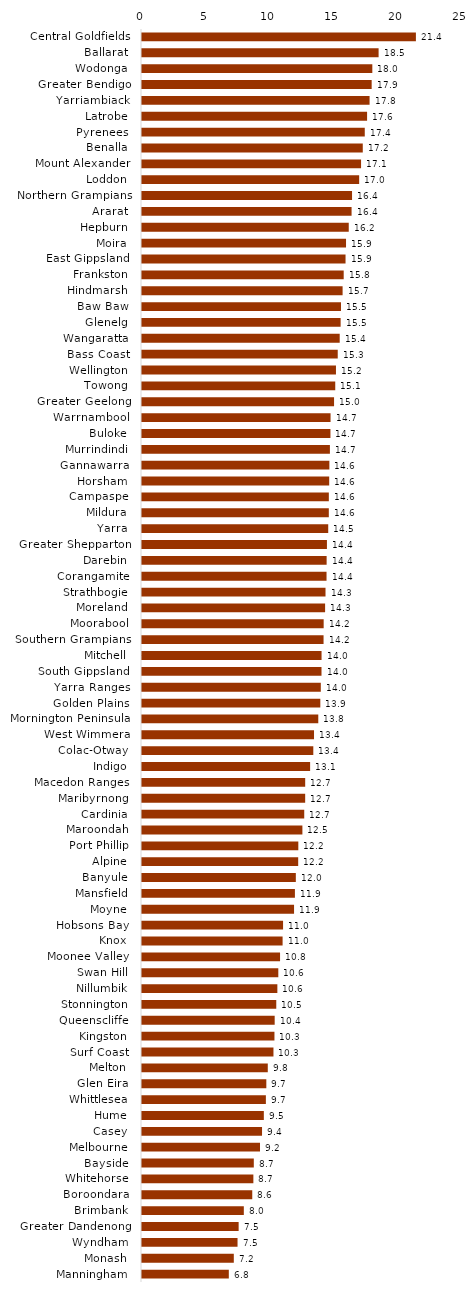
| Category | Series 0 |
|---|---|
| Central Goldfields  | 21.399 |
| Ballarat  | 18.485 |
| Wodonga  | 17.994 |
| Greater Bendigo  | 17.943 |
| Yarriambiack  | 17.779 |
| Latrobe  | 17.585 |
| Pyrenees  | 17.404 |
| Benalla  | 17.248 |
| Mount Alexander  | 17.115 |
| Loddon  | 16.967 |
| Northern Grampians  | 16.41 |
| Ararat  | 16.373 |
| Hepburn  | 16.152 |
| Moira  | 15.94 |
| East Gippsland  | 15.901 |
| Frankston  | 15.757 |
| Hindmarsh  | 15.672 |
| Baw Baw  | 15.546 |
| Glenelg  | 15.518 |
| Wangaratta  | 15.446 |
| Bass Coast  | 15.292 |
| Wellington  | 15.153 |
| Towong  | 15.098 |
| Greater Geelong  | 15.005 |
| Warrnambool  | 14.731 |
| Buloke  | 14.722 |
| Murrindindi  | 14.68 |
| Gannawarra  | 14.639 |
| Horsham  | 14.625 |
| Campaspe  | 14.596 |
| Mildura  | 14.595 |
| Yarra  | 14.549 |
| Greater Shepparton  | 14.448 |
| Darebin  | 14.424 |
| Corangamite  | 14.417 |
| Strathbogie  | 14.337 |
| Moreland  | 14.305 |
| Moorabool  | 14.193 |
| Southern Grampians  | 14.184 |
| Mitchell  | 14.028 |
| South Gippsland  | 14.024 |
| Yarra Ranges  | 13.969 |
| Golden Plains  | 13.931 |
| Mornington Peninsula  | 13.772 |
| West Wimmera  | 13.439 |
| Colac-Otway  | 13.383 |
| Indigo  | 13.134 |
| Macedon Ranges  | 12.75 |
| Maribyrnong  | 12.748 |
| Cardinia  | 12.675 |
| Maroondah  | 12.531 |
| Port Phillip  | 12.212 |
| Alpine  | 12.203 |
| Banyule  | 12.018 |
| Mansfield  | 11.946 |
| Moyne  | 11.879 |
| Hobsons Bay  | 11.021 |
| Knox  | 10.984 |
| Moonee Valley  | 10.785 |
| Swan Hill  | 10.649 |
| Nillumbik  | 10.575 |
| Stonnington  | 10.49 |
| Queenscliffe  | 10.366 |
| Kingston  | 10.348 |
| Surf Coast  | 10.27 |
| Melton  | 9.827 |
| Glen Eira  | 9.713 |
| Whittlesea  | 9.678 |
| Hume  | 9.518 |
| Casey  | 9.378 |
| Melbourne  | 9.219 |
| Bayside  | 8.735 |
| Whitehorse  | 8.701 |
| Boroondara  | 8.614 |
| Brimbank  | 7.955 |
| Greater Dandenong  | 7.55 |
| Wyndham  | 7.464 |
| Monash  | 7.172 |
| Manningham  | 6.782 |